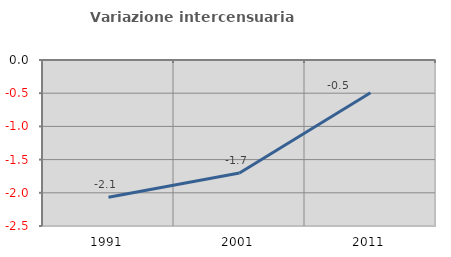
| Category | Variazione intercensuaria annua |
|---|---|
| 1991.0 | -2.068 |
| 2001.0 | -1.701 |
| 2011.0 | -0.492 |